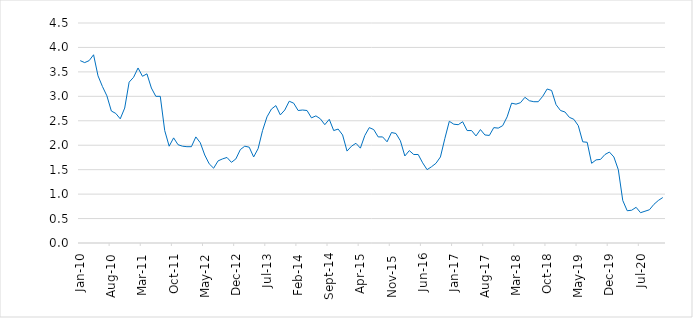
| Category | Series 0 |
|---|---|
| 2010-01-01 | 3.73 |
| 2010-02-01 | 3.69 |
| 2010-03-01 | 3.73 |
| 2010-04-01 | 3.85 |
| 2010-05-01 | 3.42 |
| 2010-06-01 | 3.2 |
| 2010-07-01 | 3.01 |
| 2010-08-01 | 2.7 |
| 2010-09-01 | 2.65 |
| 2010-10-01 | 2.54 |
| 2010-11-01 | 2.76 |
| 2010-12-01 | 3.29 |
| 2011-01-01 | 3.39 |
| 2011-02-01 | 3.58 |
| 2011-03-01 | 3.41 |
| 2011-04-01 | 3.46 |
| 2011-05-01 | 3.17 |
| 2011-06-01 | 3 |
| 2011-07-01 | 3 |
| 2011-08-01 | 2.3 |
| 2011-09-01 | 1.98 |
| 2011-10-01 | 2.15 |
| 2011-11-01 | 2.01 |
| 2011-12-01 | 1.98 |
| 2012-01-01 | 1.97 |
| 2012-02-01 | 1.97 |
| 2012-03-01 | 2.17 |
| 2012-04-01 | 2.05 |
| 2012-05-01 | 1.8 |
| 2012-06-01 | 1.62 |
| 2012-07-01 | 1.53 |
| 2012-08-01 | 1.68 |
| 2012-09-01 | 1.72 |
| 2012-10-01 | 1.75 |
| 2012-11-01 | 1.65 |
| 2012-12-01 | 1.72 |
| 2013-01-01 | 1.91 |
| 2013-02-01 | 1.98 |
| 2013-03-01 | 1.96 |
| 2013-04-01 | 1.76 |
| 2013-05-01 | 1.93 |
| 2013-06-01 | 2.3 |
| 2013-07-01 | 2.58 |
| 2013-08-01 | 2.74 |
| 2013-09-01 | 2.81 |
| 2013-10-01 | 2.62 |
| 2013-11-01 | 2.72 |
| 2013-12-01 | 2.9 |
| 2014-01-01 | 2.86 |
| 2014-02-01 | 2.71 |
| 2014-03-01 | 2.72 |
| 2014-04-01 | 2.71 |
| 2014-05-01 | 2.56 |
| 2014-06-01 | 2.6 |
| 2014-07-01 | 2.54 |
| 2014-08-01 | 2.42 |
| 2014-09-01 | 2.53 |
| 2014-10-01 | 2.3 |
| 2014-11-01 | 2.33 |
| 2014-12-01 | 2.21 |
| 2015-01-01 | 1.88 |
| 2015-02-01 | 1.98 |
| 2015-03-01 | 2.04 |
| 2015-04-01 | 1.94 |
| 2015-05-01 | 2.2 |
| 2015-06-01 | 2.36 |
| 2015-07-01 | 2.32 |
| 2015-08-01 | 2.17 |
| 2015-09-01 | 2.17 |
| 2015-10-01 | 2.07 |
| 2015-11-01 | 2.26 |
| 2015-12-01 | 2.24 |
| 2016-01-01 | 2.09 |
| 2016-02-01 | 1.78 |
| 2016-03-01 | 1.89 |
| 2016-04-01 | 1.81 |
| 2016-05-01 | 1.81 |
| 2016-06-01 | 1.64 |
| 2016-07-01 | 1.5 |
| 2016-08-01 | 1.56 |
| 2016-09-01 | 1.63 |
| 2016-10-01 | 1.76 |
| 2016-11-01 | 2.14 |
| 2016-12-01 | 2.49 |
| 2017-01-01 | 2.43 |
| 2017-02-01 | 2.42 |
| 2017-03-01 | 2.48 |
| 2017-04-01 | 2.3 |
| 2017-05-01 | 2.3 |
| 2017-06-01 | 2.19 |
| 2017-07-01 | 2.32 |
| 2017-08-01 | 2.21 |
| 2017-09-01 | 2.2 |
| 2017-10-01 | 2.36 |
| 2017-11-01 | 2.35 |
| 2017-12-01 | 2.4 |
| 2018-01-01 | 2.58 |
| 2018-02-01 | 2.86 |
| 2018-03-01 | 2.84 |
| 2018-04-01 | 2.87 |
| 2018-05-01 | 2.98 |
| 2018-06-01 | 2.91 |
| 2018-07-01 | 2.89 |
| 2018-08-01 | 2.89 |
| 2018-09-01 | 3 |
| 2018-10-01 | 3.15 |
| 2018-11-01 | 3.12 |
| 2018-12-01 | 2.83 |
| 2019-01-01 | 2.71 |
| 2019-02-01 | 2.68 |
| 2019-03-01 | 2.57 |
| 2019-04-01 | 2.53 |
| 2019-05-01 | 2.4 |
| 2019-06-01 | 2.07 |
| 2019-07-01 | 2.06 |
| 2019-08-01 | 1.63 |
| 2019-09-01 | 1.7 |
| 2019-10-01 | 1.71 |
| 2019-11-01 | 1.81 |
| 2019-12-01 | 1.86 |
| 2020-01-01 | 1.76 |
| 2020-02-01 | 1.5 |
| 2020-03-01 | 0.87 |
| 2020-04-01 | 0.66 |
| 2020-05-01 | 0.67 |
| 2020-06-01 | 0.73 |
| 2020-07-01 | 0.62 |
| 2020-08-01 | 0.65 |
| 2020-09-01 | 0.68 |
| 2020-10-01 | 0.79 |
| 2020-11-01 | 0.87 |
| 2020-12-01 | 0.93 |